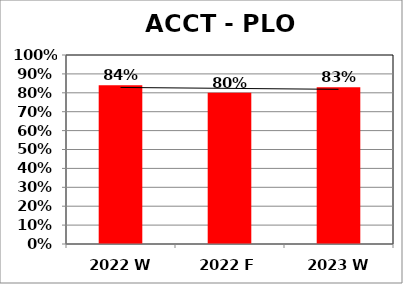
| Category | Series 0 |
|---|---|
| 2022 W | 0.84 |
| 2022 F | 0.8 |
| 2023 W | 0.83 |